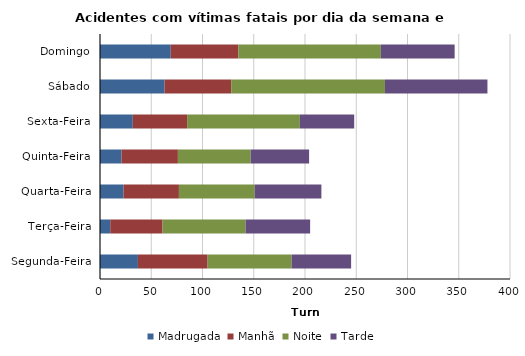
| Category | Madrugada | Manhã | Noite | Tarde |
|---|---|---|---|---|
| Segunda-Feira | 37 | 68 | 82 | 58 |
| Terça-Feira | 10 | 51 | 81 | 63 |
| Quarta-Feira | 23 | 54 | 74 | 65 |
| Quinta-Feira | 21 | 55 | 71 | 57 |
| Sexta-Feira | 32 | 53 | 110 | 53 |
| Sábado | 63 | 65 | 150 | 100 |
| Domingo | 69 | 66 | 139 | 72 |